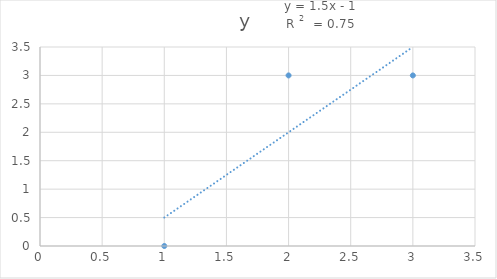
| Category | y |
|---|---|
| 1.0 | 0 |
| 2.0 | 3 |
| 3.0 | 3 |